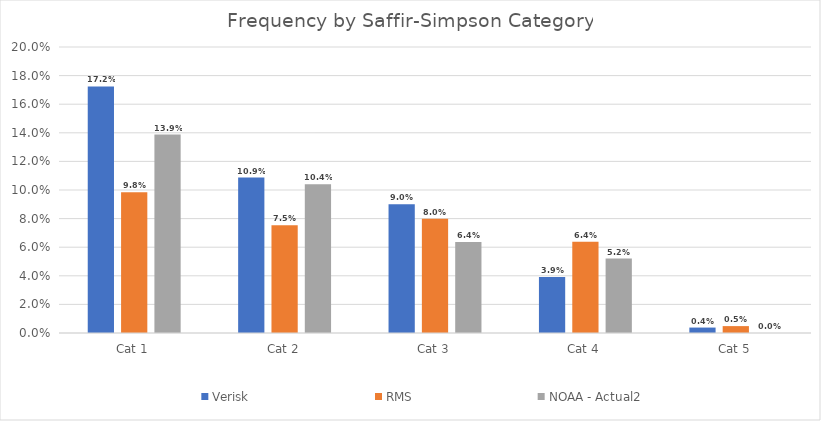
| Category | Verisk | RMS | NOAA - Actual2 |
|---|---|---|---|
| Cat 1 | 0.172 | 0.098 | 0.139 |
| Cat 2 | 0.109 | 0.075 | 0.104 |
| Cat 3 | 0.09 | 0.08 | 0.064 |
| Cat 4 | 0.039 | 0.064 | 0.052 |
| Cat 5 | 0.004 | 0.005 | 0 |